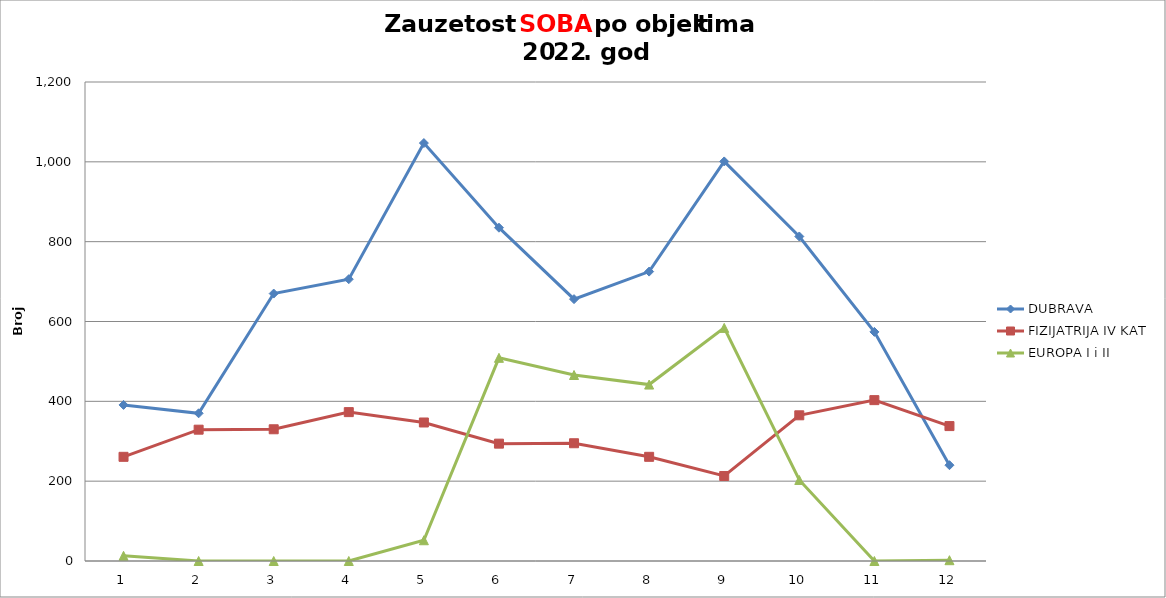
| Category | DUBRAVA | FIZIJATRIJA IV KAT | EUROPA I i II  |
|---|---|---|---|
| 0 | 391 | 261 | 13 |
| 1 | 370 | 329 | 0 |
| 2 | 670 | 330 | 0 |
| 3 | 706 | 373 | 0 |
| 4 | 1047 | 347 | 52 |
| 5 | 835 | 294 | 509 |
| 6 | 656 | 295 | 466 |
| 7 | 725 | 261 | 442 |
| 8 | 1001 | 213 | 584 |
| 9 | 813 | 365 | 203 |
| 10 | 574 | 403 | 0 |
| 11 | 240 | 338 | 2 |